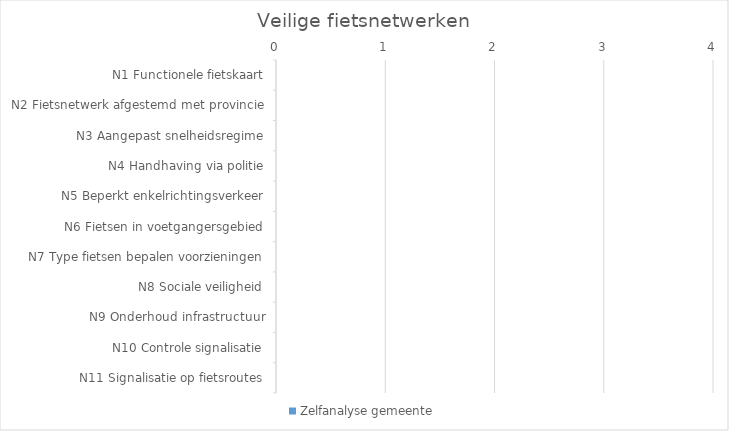
| Category | Zelfanalyse gemeente |
|---|---|
| N1 Functionele fietskaart | 0 |
| N2 Fietsnetwerk afgestemd met provincie | 0 |
| N3 Aangepast snelheidsregime | 0 |
| N4 Handhaving via politie | 0 |
| N5 Beperkt enkelrichtingsverkeer | 0 |
| N6 Fietsen in voetgangersgebied | 0 |
| N7 Type fietsen bepalen voorzieningen | 0 |
| N8 Sociale veiligheid | 0 |
| N9 Onderhoud infrastructuur | 0 |
| N10 Controle signalisatie | 0 |
| N11 Signalisatie op fietsroutes | 0 |